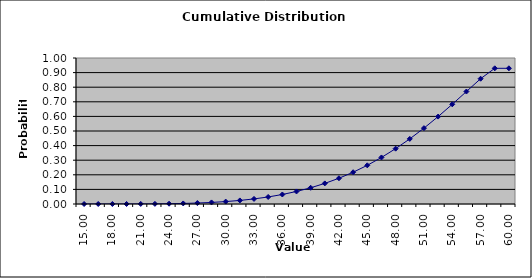
| Category | DISTRIBUTION SCHEDULE |
|---|---|
| 15.0 | 0 |
| 16.5 | 0 |
| 18.0 | 0 |
| 19.5 | 0 |
| 21.0 | 0 |
| 22.5 | 0.001 |
| 24.0 | 0.002 |
| 25.5 | 0.004 |
| 27.0 | 0.007 |
| 28.5 | 0.011 |
| 30.0 | 0.017 |
| 31.5 | 0.024 |
| 33.0 | 0.035 |
| 34.5 | 0.048 |
| 36.0 | 0.065 |
| 37.5 | 0.086 |
| 39.0 | 0.111 |
| 40.5 | 0.141 |
| 42.0 | 0.176 |
| 43.5 | 0.218 |
| 45.0 | 0.265 |
| 46.5 | 0.319 |
| 48.0 | 0.379 |
| 49.5 | 0.446 |
| 51.0 | 0.519 |
| 52.5 | 0.599 |
| 54.0 | 0.683 |
| 55.5 | 0.77 |
| 57.0 | 0.858 |
| 58.285714285714285 | 0.929 |
| 60.0 | 0.929 |